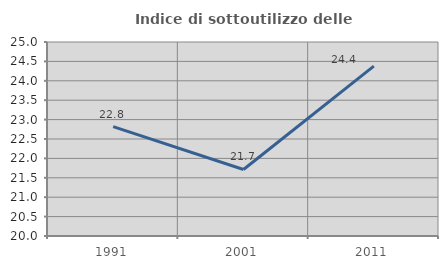
| Category | Indice di sottoutilizzo delle abitazioni  |
|---|---|
| 1991.0 | 22.818 |
| 2001.0 | 21.714 |
| 2011.0 | 24.377 |